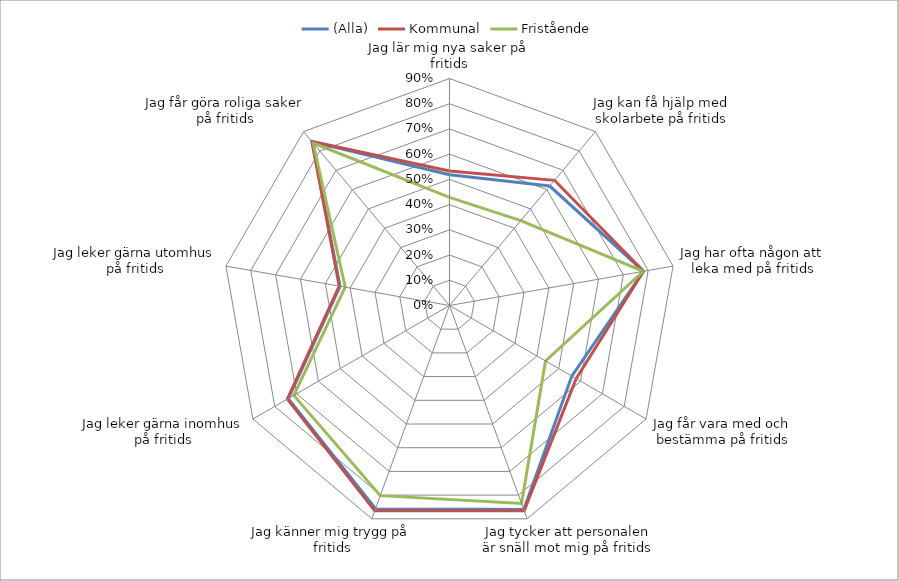
| Category | (Alla) | Kommunal | Fristående |
|---|---|---|---|
| Jag lär mig nya saker på fritids | 0.518 | 0.533 | 0.429 |
| Jag kan få hjälp med skolarbete på fritids | 0.618 | 0.648 | 0.44 |
| Jag har ofta någon att leka med på fritids | 0.781 | 0.781 | 0.78 |
| Jag får vara med och bestämma på fritids | 0.56 | 0.58 | 0.44 |
| Jag tycker att personalen är snäll mot mig på fritids | 0.861 | 0.866 | 0.835 |
| Jag känner mig trygg på fritids | 0.857 | 0.866 | 0.802 |
| Jag leker gärna inomhus på fritids | 0.738 | 0.742 | 0.713 |
| Jag leker gärna utomhus på fritids | 0.441 | 0.444 | 0.42 |
| Jag får göra roliga saker på fritids | 0.847 | 0.849 | 0.841 |